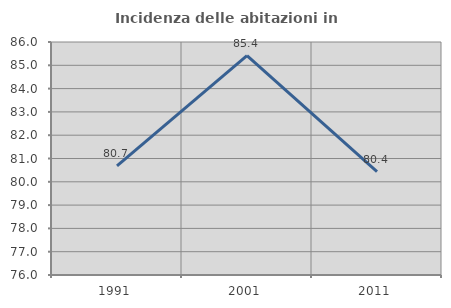
| Category | Incidenza delle abitazioni in proprietà  |
|---|---|
| 1991.0 | 80.685 |
| 2001.0 | 85.417 |
| 2011.0 | 80.435 |